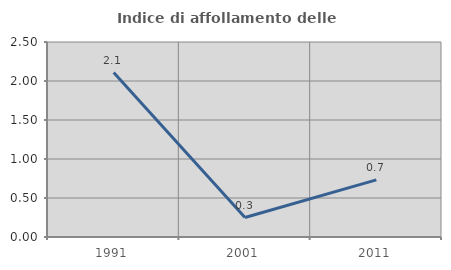
| Category | Indice di affollamento delle abitazioni  |
|---|---|
| 1991.0 | 2.108 |
| 2001.0 | 0.25 |
| 2011.0 | 0.732 |